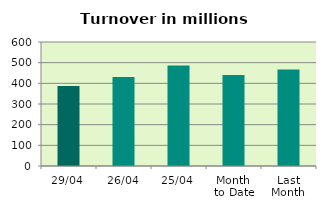
| Category | Series 0 |
|---|---|
| 29/04 | 387.04 |
| 26/04 | 431.182 |
| 25/04 | 486.616 |
| Month 
to Date | 440.767 |
| Last
Month | 466.511 |